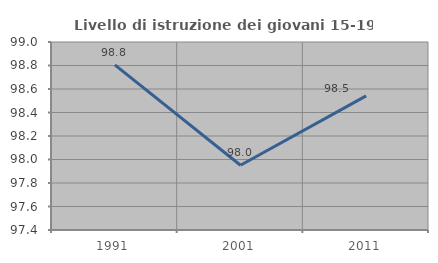
| Category | Livello di istruzione dei giovani 15-19 anni |
|---|---|
| 1991.0 | 98.806 |
| 2001.0 | 97.951 |
| 2011.0 | 98.542 |